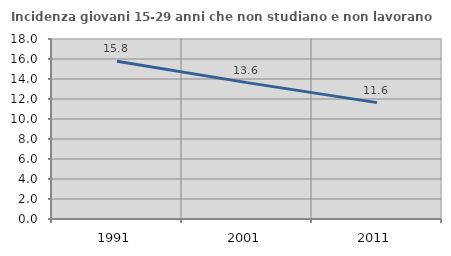
| Category | Incidenza giovani 15-29 anni che non studiano e non lavorano  |
|---|---|
| 1991.0 | 15.78 |
| 2001.0 | 13.636 |
| 2011.0 | 11.636 |